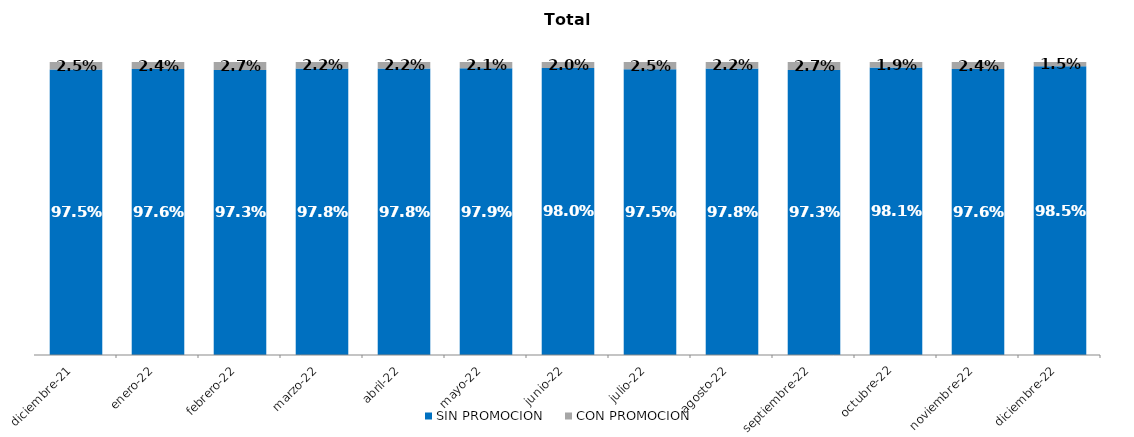
| Category | SIN PROMOCION   | CON PROMOCION   |
|---|---|---|
| 2021-12-01 | 0.975 | 0.025 |
| 2022-01-01 | 0.976 | 0.024 |
| 2022-02-01 | 0.973 | 0.027 |
| 2022-03-01 | 0.978 | 0.022 |
| 2022-04-01 | 0.978 | 0.022 |
| 2022-05-01 | 0.979 | 0.021 |
| 2022-06-01 | 0.98 | 0.02 |
| 2022-07-01 | 0.975 | 0.025 |
| 2022-08-01 | 0.978 | 0.022 |
| 2022-09-01 | 0.973 | 0.027 |
| 2022-10-01 | 0.981 | 0.019 |
| 2022-11-01 | 0.976 | 0.024 |
| 2022-12-01 | 0.985 | 0.015 |